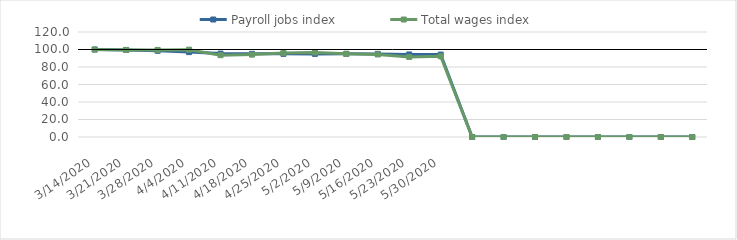
| Category | Payroll jobs index | Total wages index |
|---|---|---|
| 14/03/2020 | 100 | 100 |
| 21/03/2020 | 99.495 | 99.461 |
| 28/03/2020 | 98.544 | 99.505 |
| 04/04/2020 | 97.011 | 99.797 |
| 11/04/2020 | 95.335 | 93.511 |
| 18/04/2020 | 95.039 | 94.157 |
| 25/04/2020 | 95.059 | 95.978 |
| 02/05/2020 | 94.993 | 96.556 |
| 09/05/2020 | 95.006 | 95.064 |
| 16/05/2020 | 94.999 | 94.351 |
| 23/05/2020 | 94.337 | 91.501 |
| 30/05/2020 | 94.19 | 92.213 |